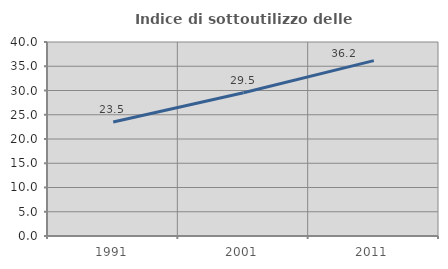
| Category | Indice di sottoutilizzo delle abitazioni  |
|---|---|
| 1991.0 | 23.505 |
| 2001.0 | 29.536 |
| 2011.0 | 36.156 |